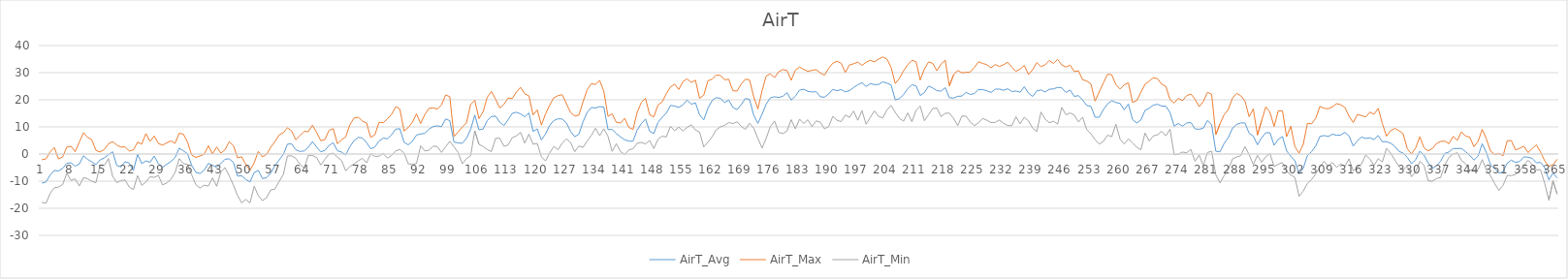
| Category | AirT_Avg | AirT_Max | AirT_Min |
|---|---|---|---|
| 0 | -10.71 | -2.11 | -17.8 |
| 1 | -10.28 | -1.8 | -18.18 |
| 2 | -7.74 | 0.81 | -14.47 |
| 3 | -6.06 | 2.39 | -12.42 |
| 4 | -6.23 | -1.83 | -12.16 |
| 5 | -5.3 | -1.06 | -11.22 |
| 6 | -3.42 | 2.54 | -7.13 |
| 7 | -3.22 | 2.88 | -9.72 |
| 8 | -4.49 | 0.85 | -9.17 |
| 9 | -3.66 | 4.39 | -11.76 |
| 10 | -0.66 | 7.84 | -8.69 |
| 11 | -1.94 | 6.09 | -9.1 |
| 12 | -2.91 | 5.28 | -10.06 |
| 13 | -3.88 | 1.32 | -10.57 |
| 14 | -2.14 | 0.78 | -4.01 |
| 15 | -1.45 | 1.66 | -4.28 |
| 16 | -0.23 | 3.78 | -1.67 |
| 17 | 0.84 | 4.56 | -8.16 |
| 18 | -4.22 | 3.33 | -10.52 |
| 19 | -4.75 | 2.57 | -9.85 |
| 20 | -2.85 | 2.64 | -9.51 |
| 21 | -3.32 | 1.08 | -12.21 |
| 22 | -6.11 | 1.55 | -13.07 |
| 23 | -0.12 | 4.37 | -7.99 |
| 24 | -3.54 | 3.67 | -11.54 |
| 25 | -2.52 | 7.53 | -10.32 |
| 26 | -3.04 | 4.69 | -8.38 |
| 27 | -0.74 | 6.64 | -8.62 |
| 28 | -3.59 | 3.88 | -7.88 |
| 29 | -4.9 | 3.29 | -11.37 |
| 30 | -3.79 | 4.13 | -10.66 |
| 31 | -2.75 | 4.86 | -9.33 |
| 32 | -1.36 | 3.94 | -6.86 |
| 33 | 2.19 | 7.65 | -1.69 |
| 34 | 1.18 | 7.34 | -3.53 |
| 35 | 0.1 | 4.43 | -3.81 |
| 36 | -4.17 | -0.39 | -7.68 |
| 37 | -6.74 | -1.26 | -11.31 |
| 38 | -7.18 | -0.72 | -12.56 |
| 39 | -5.93 | -0.07 | -11.51 |
| 40 | -3.46 | 3.04 | -11.78 |
| 41 | -4.14 | 0.04 | -8.79 |
| 42 | -4.92 | 2.62 | -11.89 |
| 43 | -3.5 | 0.34 | -6.72 |
| 44 | -1.93 | 1.57 | -4.99 |
| 45 | -1.78 | 4.52 | -8.02 |
| 46 | -3.02 | 3.18 | -11.38 |
| 47 | -8.12 | -1.36 | -15.26 |
| 48 | -8.03 | -1.04 | -17.99 |
| 49 | -9.37 | -3.88 | -16.75 |
| 50 | -10.31 | -6.06 | -18.02 |
| 51 | -6.86 | -3.24 | -11.89 |
| 52 | -6.03 | 0.96 | -15.3 |
| 53 | -9.06 | -1.01 | -17.2 |
| 54 | -8.73 | -0.12 | -16.07 |
| 55 | -7.02 | 2.54 | -13.21 |
| 56 | -4.25 | 4.6 | -12.94 |
| 57 | -2.2 | 7.01 | -10.09 |
| 58 | -0.19 | 7.88 | -7.64 |
| 59 | 3.64 | 9.69 | -0.72 |
| 60 | 3.77 | 8.5 | -0.65 |
| 61 | 1.55 | 5.27 | -1.57 |
| 62 | 0.94 | 6.76 | -3.73 |
| 63 | 1.14 | 8.32 | -5.27 |
| 64 | 2.46 | 8.26 | -0.48 |
| 65 | 4.59 | 10.63 | -0.48 |
| 66 | 2.57 | 8.06 | -1.29 |
| 67 | 0.82 | 4.87 | -4.04 |
| 68 | 1.35 | 5.38 | -1.96 |
| 69 | 3.16 | 8.73 | 0.03 |
| 70 | 4.19 | 9.34 | 0.31 |
| 71 | 1.2 | 3.79 | -1.15 |
| 72 | 0.73 | 5.23 | -2.41 |
| 73 | -0.31 | 6.34 | -6.21 |
| 74 | 2.76 | 10.81 | -4.58 |
| 75 | 4.94 | 13.26 | -3.63 |
| 76 | 6.13 | 13.57 | -2.51 |
| 77 | 5.95 | 12.14 | -1.57 |
| 78 | 4.23 | 11.46 | -3.26 |
| 79 | 1.94 | 6.11 | 0.16 |
| 80 | 2.61 | 7.11 | -0.88 |
| 81 | 4.79 | 11.67 | -0.81 |
| 82 | 5.85 | 11.53 | 0.24 |
| 83 | 5.62 | 12.95 | -1.52 |
| 84 | 7.09 | 14.58 | -0.54 |
| 85 | 9.17 | 17.47 | 1.21 |
| 86 | 9.34 | 16.59 | 1.66 |
| 87 | 4.36 | 8.5 | 0.43 |
| 88 | 3.4 | 9.75 | -3.57 |
| 89 | 4.64 | 11.7 | -3.87 |
| 90 | 6.99 | 14.79 | -3.46 |
| 91 | 7.39 | 11.24 | 3.05 |
| 92 | 7.64 | 14.55 | 1.14 |
| 93 | 9.2 | 16.82 | 1.38 |
| 94 | 10.13 | 16.99 | 2.92 |
| 95 | 10.39 | 16.58 | 2.73 |
| 96 | 10.1 | 18.07 | 0.61 |
| 97 | 12.93 | 21.79 | 2.71 |
| 98 | 12.29 | 21.13 | 4.67 |
| 99 | 4.41 | 6.43 | 2.64 |
| 100 | 4.08 | 8.12 | 0.54 |
| 101 | 3.95 | 9.98 | -3.6 |
| 102 | 5.78 | 11.49 | -1.69 |
| 103 | 9.06 | 18.28 | -0.61 |
| 104 | 14.36 | 19.79 | 8.57 |
| 105 | 8.93 | 13.06 | 3.58 |
| 106 | 9.21 | 15.61 | 2.78 |
| 107 | 12.36 | 20.94 | 1.62 |
| 108 | 13.83 | 23.05 | 0.91 |
| 109 | 13.97 | 20.23 | 5.78 |
| 110 | 11.74 | 16.94 | 5.81 |
| 111 | 10.49 | 18.31 | 2.85 |
| 112 | 12.65 | 20.64 | 3.32 |
| 113 | 15 | 20.43 | 6.02 |
| 114 | 15.41 | 22.88 | 6.7 |
| 115 | 14.78 | 24.57 | 7.99 |
| 116 | 13.74 | 22.2 | 4 |
| 117 | 15.15 | 21.46 | 7.31 |
| 118 | 8.33 | 14.41 | 3.62 |
| 119 | 9.26 | 16.26 | 3.9 |
| 120 | 5.17 | 10.68 | -1.06 |
| 121 | 7.43 | 14.83 | -2.54 |
| 122 | 10.6 | 18.07 | 0.46 |
| 123 | 12.36 | 20.78 | 2.81 |
| 124 | 12.99 | 21.52 | 1.58 |
| 125 | 12.91 | 21.89 | 4.02 |
| 126 | 11.49 | 18.57 | 5.58 |
| 127 | 8.36 | 15.32 | 4.26 |
| 128 | 6.38 | 14.02 | 0.85 |
| 129 | 7.29 | 14.33 | 2.95 |
| 130 | 11.89 | 19.28 | 2.47 |
| 131 | 15.36 | 23.74 | 4.81 |
| 132 | 17.15 | 25.92 | 6.91 |
| 133 | 16.98 | 25.67 | 9.51 |
| 134 | 17.47 | 27.11 | 6.77 |
| 135 | 17.3 | 23.09 | 9.32 |
| 136 | 9.01 | 13.91 | 6.49 |
| 137 | 9.04 | 14.79 | 0.98 |
| 138 | 7.56 | 11.69 | 3.82 |
| 139 | 6.32 | 11.42 | 0.92 |
| 140 | 5.27 | 13.15 | -0.2 |
| 141 | 4.76 | 9.84 | 1.52 |
| 142 | 4.71 | 9.03 | 1.93 |
| 143 | 8.83 | 15.34 | 3.97 |
| 144 | 11.19 | 19.02 | 4.28 |
| 145 | 12.91 | 20.54 | 3.73 |
| 146 | 8.42 | 14.51 | 5.01 |
| 147 | 7.54 | 13.69 | 2.03 |
| 148 | 11.64 | 18.08 | 5.42 |
| 149 | 13.56 | 19.19 | 6.59 |
| 150 | 15.05 | 22.2 | 6.29 |
| 151 | 17.91 | 24.77 | 10.22 |
| 152 | 17.7 | 25.75 | 8.56 |
| 153 | 17.16 | 23.8 | 9.94 |
| 154 | 18.11 | 26.72 | 8.5 |
| 155 | 19.92 | 27.72 | 9.82 |
| 156 | 18.35 | 26.38 | 10.77 |
| 157 | 18.9 | 27.22 | 8.88 |
| 158 | 14.45 | 20.53 | 8.05 |
| 159 | 12.59 | 21.71 | 2.6 |
| 160 | 16.88 | 27 | 4.35 |
| 161 | 19.72 | 27.61 | 6.32 |
| 162 | 20.82 | 29.06 | 8.96 |
| 163 | 20.51 | 29 | 10.02 |
| 164 | 18.98 | 27.39 | 10.54 |
| 165 | 19.87 | 27.56 | 11.62 |
| 166 | 17.21 | 23.34 | 11.21 |
| 167 | 16.37 | 23.23 | 11.89 |
| 168 | 18.2 | 25.83 | 10.2 |
| 169 | 20.49 | 27.61 | 9.07 |
| 170 | 20.12 | 27.33 | 11.36 |
| 171 | 14.32 | 21.12 | 9.54 |
| 172 | 11.31 | 16.59 | 5.76 |
| 173 | 14.64 | 23.34 | 2.2 |
| 174 | 18.42 | 28.78 | 5.81 |
| 175 | 20.72 | 29.56 | 10.16 |
| 176 | 21.1 | 28.17 | 12.16 |
| 177 | 20.84 | 30.33 | 7.99 |
| 178 | 21.3 | 31.11 | 7.55 |
| 179 | 22.64 | 30.83 | 8.52 |
| 180 | 19.91 | 27.17 | 12.66 |
| 181 | 21.3 | 30.94 | 9.28 |
| 182 | 23.57 | 32.06 | 12.86 |
| 183 | 23.88 | 31.22 | 11.24 |
| 184 | 23.1 | 30.5 | 12.66 |
| 185 | 22.9 | 30.83 | 10.07 |
| 186 | 22.96 | 31.11 | 12.22 |
| 187 | 21.12 | 29.89 | 11.73 |
| 188 | 20.93 | 29.06 | 9.28 |
| 189 | 22.14 | 31.61 | 10.13 |
| 190 | 23.85 | 33.5 | 13.88 |
| 191 | 23.33 | 34.22 | 12.42 |
| 192 | 23.77 | 33.44 | 11.97 |
| 193 | 22.94 | 30.06 | 14.37 |
| 194 | 23.39 | 32.83 | 13.51 |
| 195 | 24.54 | 33.28 | 15.84 |
| 196 | 25.52 | 33.89 | 12.43 |
| 197 | 26.3 | 32.67 | 15.99 |
| 198 | 24.89 | 33.83 | 10.99 |
| 199 | 25.96 | 34.56 | 13.47 |
| 200 | 25.6 | 33.94 | 15.9 |
| 201 | 25.66 | 35 | 13.91 |
| 202 | 26.59 | 35.78 | 13.3 |
| 203 | 26.14 | 35 | 16.28 |
| 204 | 25.48 | 31.94 | 17.94 |
| 205 | 19.95 | 25.99 | 15.33 |
| 206 | 20.45 | 27.94 | 13.14 |
| 207 | 21.9 | 30.67 | 12.13 |
| 208 | 24.14 | 32.94 | 15.16 |
| 209 | 25.53 | 34.56 | 11.91 |
| 210 | 25.11 | 34.06 | 16.14 |
| 211 | 21.58 | 27.33 | 17.67 |
| 212 | 22.6 | 31.33 | 12.26 |
| 213 | 25.04 | 33.94 | 14.49 |
| 214 | 24.36 | 33.44 | 16.78 |
| 215 | 23.37 | 30.67 | 16.93 |
| 216 | 23.2 | 33.17 | 13.81 |
| 217 | 24.47 | 34.61 | 15 |
| 218 | 20.77 | 25.13 | 15.07 |
| 219 | 20.62 | 29.17 | 13.19 |
| 220 | 21.27 | 30.83 | 10.43 |
| 221 | 21.37 | 29.94 | 13.98 |
| 222 | 22.72 | 30.11 | 13.98 |
| 223 | 21.98 | 30.22 | 11.79 |
| 224 | 22.31 | 31.89 | 10.43 |
| 225 | 23.8 | 34 | 11.53 |
| 226 | 23.74 | 33.39 | 13.13 |
| 227 | 23.31 | 32.94 | 12.45 |
| 228 | 22.69 | 31.78 | 11.6 |
| 229 | 23.89 | 33 | 11.65 |
| 230 | 23.96 | 32.28 | 12.52 |
| 231 | 23.5 | 32.94 | 11.31 |
| 232 | 24.06 | 33.83 | 10.53 |
| 233 | 23.04 | 32 | 10.44 |
| 234 | 23.22 | 30.5 | 13.74 |
| 235 | 22.8 | 31.33 | 11.2 |
| 236 | 24.82 | 32.67 | 13.54 |
| 237 | 22.46 | 29.28 | 12.21 |
| 238 | 21.23 | 31.11 | 9.52 |
| 239 | 23.28 | 33.72 | 8.29 |
| 240 | 23.62 | 32.22 | 15.46 |
| 241 | 22.89 | 32.89 | 12.87 |
| 242 | 23.87 | 34.5 | 11.53 |
| 243 | 24.02 | 33.39 | 12.09 |
| 244 | 24.57 | 34.89 | 11.04 |
| 245 | 24.39 | 32.83 | 17.16 |
| 246 | 22.66 | 32.06 | 14.48 |
| 247 | 23.63 | 32.78 | 15.15 |
| 248 | 21.23 | 30.39 | 14.36 |
| 249 | 21.55 | 30.67 | 11.82 |
| 250 | 19.93 | 27.39 | 13.61 |
| 251 | 17.91 | 26.94 | 8.94 |
| 252 | 17.58 | 25.81 | 7.47 |
| 253 | 13.55 | 19.51 | 5.31 |
| 254 | 13.57 | 22.91 | 3.66 |
| 255 | 16.39 | 26.27 | 4.66 |
| 256 | 18.49 | 29.44 | 6.94 |
| 257 | 19.65 | 29.22 | 6.39 |
| 258 | 19 | 25.57 | 11.01 |
| 259 | 18.64 | 23.96 | 5.5 |
| 260 | 16.28 | 25.51 | 3.71 |
| 261 | 18.44 | 26.23 | 5.54 |
| 262 | 12.69 | 19.03 | 4.14 |
| 263 | 11.42 | 19.69 | 2.51 |
| 264 | 12.55 | 22.76 | 1.56 |
| 265 | 16.1 | 25.72 | 7.72 |
| 266 | 16.91 | 26.89 | 4.79 |
| 267 | 18.04 | 28.11 | 6.7 |
| 268 | 18.34 | 27.78 | 7.07 |
| 269 | 17.67 | 25.72 | 8.4 |
| 270 | 17.62 | 24.94 | 6.7 |
| 271 | 15.3 | 20.07 | 9.15 |
| 272 | 10.28 | 18.81 | -0.27 |
| 273 | 11.27 | 20.57 | -0.01 |
| 274 | 10.29 | 19.66 | 0.72 |
| 275 | 11.45 | 21.52 | 0.44 |
| 276 | 11.64 | 22.13 | 1.72 |
| 277 | 9.3 | 20.27 | -2.66 |
| 278 | 9.12 | 17.44 | -0.36 |
| 279 | 9.55 | 19.43 | -4.35 |
| 280 | 12.38 | 22.76 | 0.57 |
| 281 | 10.76 | 22 | 1.04 |
| 282 | 1.04 | 7.17 | -7.66 |
| 283 | 0.82 | 11.09 | -10.69 |
| 284 | 3.9 | 14.47 | -7.95 |
| 285 | 6.03 | 16.41 | -5.63 |
| 286 | 9.53 | 20.64 | -1.83 |
| 287 | 10.91 | 22.35 | -1.06 |
| 288 | 11.47 | 21.49 | -0.62 |
| 289 | 11.47 | 19.51 | 2.73 |
| 290 | 7.66 | 13.76 | -0.14 |
| 291 | 6.61 | 16.63 | -3.88 |
| 292 | 3.41 | 7.02 | -0.49 |
| 293 | 5.98 | 12.26 | -3.04 |
| 294 | 7.86 | 17.39 | -0.97 |
| 295 | 7.86 | 15.44 | 0.14 |
| 296 | 3.22 | 10.16 | -4.59 |
| 297 | 5.41 | 15.92 | -3.77 |
| 298 | 6.43 | 15.92 | -3.14 |
| 299 | 1.18 | 6.4 | -6.39 |
| 300 | -0.82 | 10.26 | -7.65 |
| 301 | -2.49 | 2.69 | -8.67 |
| 302 | -7.41 | 0.32 | -15.58 |
| 303 | -5.23 | 3.59 | -13.66 |
| 304 | -0.57 | 11.33 | -10.85 |
| 305 | 0.88 | 11.13 | -9.42 |
| 306 | 2.97 | 13.19 | -7.32 |
| 307 | 6.48 | 17.58 | -4.69 |
| 308 | 6.83 | 16.85 | -2.73 |
| 309 | 6.45 | 16.73 | -4.53 |
| 310 | 7.32 | 17.37 | -3.08 |
| 311 | 6.9 | 18.57 | -4.92 |
| 312 | 7 | 18.16 | -3.68 |
| 313 | 7.98 | 17.19 | -4.53 |
| 314 | 6.65 | 13.98 | -1.76 |
| 315 | 2.92 | 11.6 | -6.24 |
| 316 | 4.87 | 14.58 | -4.82 |
| 317 | 6.25 | 14.19 | -3.71 |
| 318 | 5.75 | 13.68 | -0.34 |
| 319 | 5.97 | 15.44 | -1.85 |
| 320 | 5.31 | 14.66 | -4.21 |
| 321 | 6.85 | 16.83 | -1.72 |
| 322 | 4.54 | 11.26 | -2.96 |
| 323 | 4.56 | 6.59 | 2.08 |
| 324 | 3.98 | 8.62 | 0.36 |
| 325 | 2.85 | 9.46 | -2.18 |
| 326 | 0.97 | 8.61 | -4.58 |
| 327 | 0.38 | 7.46 | -5.86 |
| 328 | -1.23 | 1.95 | -4.46 |
| 329 | -3.57 | 0.03 | -8.37 |
| 330 | -2.09 | 2.24 | -6.55 |
| 331 | 1.05 | 6.37 | -2.7 |
| 332 | -0.36 | 2.32 | -4.09 |
| 333 | -3.26 | 1.15 | -9.81 |
| 334 | -5.37 | 1.98 | -10.06 |
| 335 | -4.32 | 3.87 | -9.02 |
| 336 | -2.64 | 4.67 | -8.68 |
| 337 | 0.24 | 4.74 | -4.11 |
| 338 | 0.76 | 3.85 | -1.21 |
| 339 | 2.04 | 6.48 | -0.04 |
| 340 | 2.02 | 5.04 | 0.49 |
| 341 | 2.08 | 8.16 | -2.34 |
| 342 | 0.89 | 6.62 | -3.55 |
| 343 | -0.49 | 6.18 | -5.92 |
| 344 | -2.24 | 2.7 | -5.79 |
| 345 | -0.73 | 4.68 | -5.7 |
| 346 | 3.8 | 9.08 | -2.04 |
| 347 | 0.51 | 5.52 | -5.86 |
| 348 | -3.98 | 1.07 | -8.04 |
| 349 | -5.31 | -0.19 | -10.95 |
| 350 | -7.04 | 0.24 | -13.41 |
| 351 | -6.53 | -0.65 | -11.5 |
| 352 | -3.33 | 4.91 | -7.88 |
| 353 | -2.24 | 4.91 | -7.96 |
| 354 | -3.08 | 1.49 | -7.52 |
| 355 | -2.69 | 2.16 | -6.08 |
| 356 | -1.05 | 2.9 | -4.2 |
| 357 | -1.15 | 0.53 | -2.26 |
| 358 | -1.59 | 2.02 | -3.91 |
| 359 | -3.24 | 3.37 | -5.83 |
| 360 | -3.09 | 0.75 | -5.79 |
| 361 | -5.02 | -2.51 | -10.81 |
| 362 | -9.53 | -4.49 | -17.01 |
| 363 | -7 | -3.97 | -9.92 |
| 364 | -8.79 | -1.92 | -14.79 |